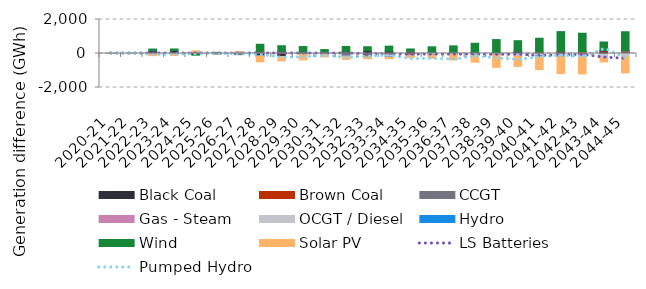
| Category | Black Coal | Brown Coal | CCGT | Gas - Steam | OCGT / Diesel | Hydro | Wind | Solar PV |
|---|---|---|---|---|---|---|---|---|
| 2020-21 | 0.007 | 0 | 0 | 0 | 0 | -0.005 | 0 | 0.027 |
| 2021-22 | 1.922 | 0.022 | 0.353 | 0 | 0 | -2.313 | 0 | -0.003 |
| 2022-23 | 167.702 | -13.536 | 2.742 | 0.324 | -0.536 | 16.93 | 73.504 | -109.961 |
| 2023-24 | 174.288 | -7.744 | -8.393 | -0.77 | -0.112 | 5.876 | 85.785 | -93.564 |
| 2024-25 | 72.221 | -45.18 | -2.973 | 0.475 | 0.031 | 8.504 | -51.344 | 73.132 |
| 2025-26 | -21.705 | 17.044 | -1.691 | 0.204 | 0.201 | -1.941 | 45.405 | -1.974 |
| 2026-27 | -58.369 | 47.563 | -8.787 | 0.27 | 0.112 | 4.622 | 15.202 | 41.622 |
| 2027-28 | -144.012 | 104.795 | -5.86 | -0.144 | 0.031 | -3.513 | 437.846 | -337.41 |
| 2028-29 | -174.367 | 120.565 | 0.618 | -0.05 | 0.357 | 0.383 | 335.573 | -258.715 |
| 2029-30 | -47.562 | 36.31 | -9.925 | 1.346 | 0.306 | 3.002 | 367.595 | -319.745 |
| 2030-31 | -1.106 | 17.931 | -36.226 | -1.075 | -3.277 | 0.841 | 212.904 | -156.973 |
| 2031-32 | 100.284 | -25.235 | -102.654 | -5.109 | -8.109 | -23.281 | 315.372 | -185.543 |
| 2032-33 | 171.466 | -74.98 | -112.361 | -2.131 | -15.429 | -5.239 | 225.726 | -97.264 |
| 2033-34 | 135.683 | -19.565 | -74.242 | -13.152 | -79.088 | -26.74 | 296.63 | -95.426 |
| 2034-35 | 105.422 | -89.086 | 30.294 | -3.139 | -4.339 | -26.816 | 133.139 | -116.154 |
| 2035-36 | 29.724 | 6.42 | 54.799 | -4.488 | -84.35 | -7.094 | 301.262 | -192.234 |
| 2036-37 | 3.357 | 4.525 | 50.363 | -5.77 | -42.606 | -9.034 | 391.101 | -320.012 |
| 2037-38 | 44.353 | 15.148 | -6.4 | -5.424 | -71.005 | -6.327 | 543.511 | -418.543 |
| 2038-39 | 30.292 | 12.684 | -2.518 | 0.221 | -57.023 | -14.022 | 775.464 | -742.23 |
| 2039-40 | 131.118 | -10.369 | -6.875 | -7.419 | -129.977 | 2.499 | 621.093 | -602.234 |
| 2040-41 | 30.508 | 46.261 | -45.399 | -2.119 | -78.503 | -31.74 | 821.188 | -786.768 |
| 2041-42 | 94.448 | 30.979 | -78.473 | -7.765 | -110.315 | -2.182 | 1162.282 | -982.573 |
| 2042-43 | 29.462 | 80.917 | -94.541 | -0.652 | -99.53 | 6.249 | 1074.169 | -1003.857 |
| 2043-44 | 131.732 | 45.478 | -48.029 | 1.963 | -184.225 | 10.692 | 487.574 | -267.572 |
| 2044-45 | 85.917 | 49.209 | 33.11 | 0.738 | -186.191 | 4.287 | 1106.038 | -955.47 |